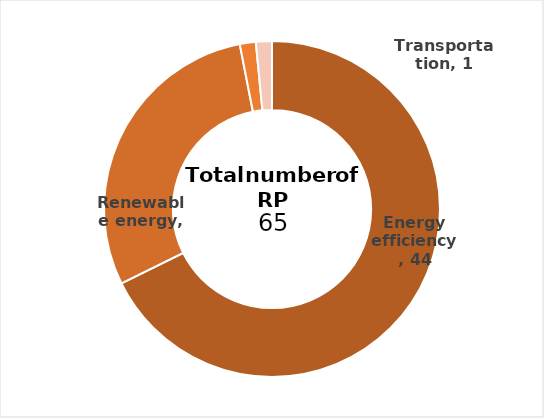
| Category | Series 0 |
|---|---|
| 0 | 44 |
| 1 | 19 |
| 2 | 1 |
| 3 | 1 |